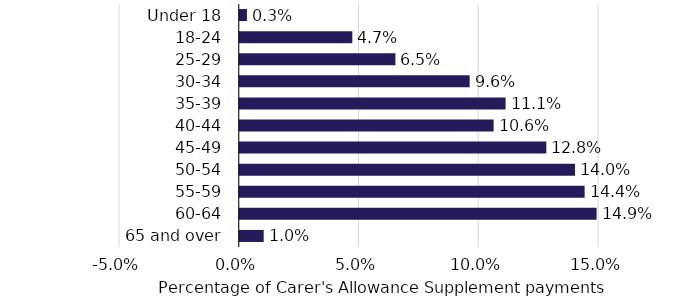
| Category | Series 0 |
|---|---|
| Under 18 | 0.003 |
| 18-24 | 0.047 |
| 25-29 | 0.065 |
| 30-34 | 0.096 |
| 35-39 | 0.111 |
| 40-44 | 0.106 |
| 45-49 | 0.128 |
| 50-54 | 0.14 |
| 55-59 | 0.144 |
| 60-64 | 0.149 |
| 65 and over | 0.01 |